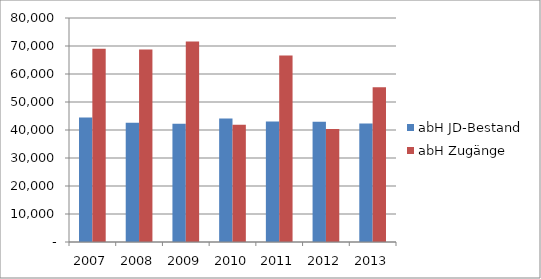
| Category | abH JD-Bestand | abH Zugänge |
|---|---|---|
| 2007.0 | 44463.25 | 68989 |
| 2008.0 | 42565.667 | 68758 |
| 2009.0 | 42220.417 | 71631 |
| 2010.0 | 44092.167 | 41838 |
| 2011.0 | 43041.417 | 66572 |
| 2012.0 | 42935.333 | 40371 |
| 2013.0 | 42355.833 | 55232 |